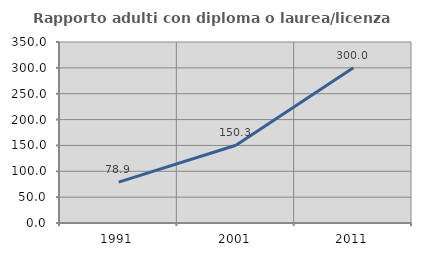
| Category | Rapporto adulti con diploma o laurea/licenza media  |
|---|---|
| 1991.0 | 78.947 |
| 2001.0 | 150.311 |
| 2011.0 | 300 |